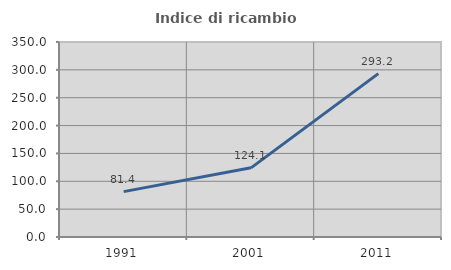
| Category | Indice di ricambio occupazionale  |
|---|---|
| 1991.0 | 81.425 |
| 2001.0 | 124.138 |
| 2011.0 | 293.243 |